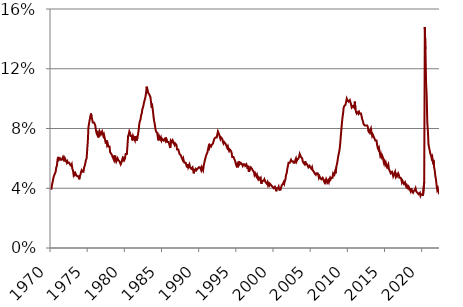
| Category | Series 0 |
|---|---|
| 1970.0 | 3.9 |
| 1970.0 | 4.2 |
| 1970.0 | 4.4 |
| 1970.0 | 4.6 |
| 1970.0 | 4.8 |
| 1970.0 | 4.9 |
| 1970.0 | 5 |
| 1970.0 | 5.1 |
| 1970.0 | 5.4 |
| 1970.0 | 5.5 |
| 1970.0 | 5.9 |
| 1970.0 | 6.1 |
| 1971.0 | 5.9 |
| 1971.0 | 5.9 |
| 1971.0 | 6 |
| 1971.0 | 5.9 |
| 1971.0 | 5.9 |
| 1971.0 | 5.9 |
| 1971.0 | 6 |
| 1971.0 | 6.1 |
| 1971.0 | 6 |
| 1971.0 | 5.8 |
| 1971.0 | 6 |
| 1971.0 | 6 |
| 1972.0 | 5.8 |
| 1972.0 | 5.7 |
| 1972.0 | 5.8 |
| 1972.0 | 5.7 |
| 1972.0 | 5.7 |
| 1972.0 | 5.7 |
| 1972.0 | 5.6 |
| 1972.0 | 5.6 |
| 1972.0 | 5.5 |
| 1972.0 | 5.6 |
| 1972.0 | 5.3 |
| 1972.0 | 5.2 |
| 1973.0 | 4.9 |
| 1973.0 | 5 |
| 1973.0 | 4.9 |
| 1973.0 | 5 |
| 1973.0 | 4.9 |
| 1973.0 | 4.9 |
| 1973.0 | 4.8 |
| 1973.0 | 4.8 |
| 1973.0 | 4.8 |
| 1973.0 | 4.6 |
| 1973.0 | 4.8 |
| 1973.0 | 4.9 |
| 1974.0 | 5.1 |
| 1974.0 | 5.2 |
| 1974.0 | 5.1 |
| 1974.0 | 5.1 |
| 1974.0 | 5.1 |
| 1974.0 | 5.4 |
| 1974.0 | 5.5 |
| 1974.0 | 5.5 |
| 1974.0 | 5.9 |
| 1974.0 | 6 |
| 1974.0 | 6.6 |
| 1974.0 | 7.2 |
| 1975.0 | 8.1 |
| 1975.0 | 8.1 |
| 1975.0 | 8.6 |
| 1975.0 | 8.8 |
| 1975.0 | 9 |
| 1975.0 | 8.8 |
| 1975.0 | 8.6 |
| 1975.0 | 8.4 |
| 1975.0 | 8.4 |
| 1975.0 | 8.4 |
| 1975.0 | 8.3 |
| 1975.0 | 8.2 |
| 1976.0 | 7.9 |
| 1976.0 | 7.7 |
| 1976.0 | 7.6 |
| 1976.0 | 7.7 |
| 1976.0 | 7.4 |
| 1976.0 | 7.6 |
| 1976.0 | 7.8 |
| 1976.0 | 7.8 |
| 1976.0 | 7.6 |
| 1976.0 | 7.7 |
| 1976.0 | 7.8 |
| 1976.0 | 7.8 |
| 1977.0 | 7.5 |
| 1977.0 | 7.6 |
| 1977.0 | 7.4 |
| 1977.0 | 7.2 |
| 1977.0 | 7 |
| 1977.0 | 7.2 |
| 1977.0 | 6.9 |
| 1977.0 | 7 |
| 1977.0 | 6.8 |
| 1977.0 | 6.8 |
| 1977.0 | 6.8 |
| 1977.0 | 6.4 |
| 1978.0 | 6.4 |
| 1978.0 | 6.3 |
| 1978.0 | 6.3 |
| 1978.0 | 6.1 |
| 1978.0 | 6 |
| 1978.0 | 5.9 |
| 1978.0 | 6.2 |
| 1978.0 | 5.9 |
| 1978.0 | 6 |
| 1978.0 | 5.8 |
| 1978.0 | 5.9 |
| 1978.0 | 6 |
| 1979.0 | 5.9 |
| 1979.0 | 5.9 |
| 1979.0 | 5.8 |
| 1979.0 | 5.8 |
| 1979.0 | 5.6 |
| 1979.0 | 5.7 |
| 1979.0 | 5.7 |
| 1979.0 | 6 |
| 1979.0 | 5.9 |
| 1979.0 | 6 |
| 1979.0 | 5.9 |
| 1979.0 | 6 |
| 1980.0 | 6.3 |
| 1980.0 | 6.3 |
| 1980.0 | 6.3 |
| 1980.0 | 6.9 |
| 1980.0 | 7.5 |
| 1980.0 | 7.6 |
| 1980.0 | 7.8 |
| 1980.0 | 7.7 |
| 1980.0 | 7.5 |
| 1980.0 | 7.5 |
| 1980.0 | 7.5 |
| 1980.0 | 7.2 |
| 1981.0 | 7.5 |
| 1981.0 | 7.4 |
| 1981.0 | 7.4 |
| 1981.0 | 7.2 |
| 1981.0 | 7.5 |
| 1981.0 | 7.5 |
| 1981.0 | 7.2 |
| 1981.0 | 7.4 |
| 1981.0 | 7.6 |
| 1981.0 | 7.9 |
| 1981.0 | 8.3 |
| 1981.0 | 8.5 |
| 1982.0 | 8.6 |
| 1982.0 | 8.9 |
| 1982.0 | 9 |
| 1982.0 | 9.3 |
| 1982.0 | 9.4 |
| 1982.0 | 9.6 |
| 1982.0 | 9.8 |
| 1982.0 | 9.8 |
| 1982.0 | 10.1 |
| 1982.0 | 10.4 |
| 1982.0 | 10.8 |
| 1982.0 | 10.8 |
| 1983.0 | 10.4 |
| 1983.0 | 10.4 |
| 1983.0 | 10.3 |
| 1983.0 | 10.2 |
| 1983.0 | 10.1 |
| 1983.0 | 10.1 |
| 1983.0 | 9.4 |
| 1983.0 | 9.5 |
| 1983.0 | 9.2 |
| 1983.0 | 8.8 |
| 1983.0 | 8.5 |
| 1983.0 | 8.3 |
| 1984.0 | 8 |
| 1984.0 | 7.8 |
| 1984.0 | 7.8 |
| 1984.0 | 7.7 |
| 1984.0 | 7.4 |
| 1984.0 | 7.2 |
| 1984.0 | 7.5 |
| 1984.0 | 7.5 |
| 1984.0 | 7.3 |
| 1984.0 | 7.4 |
| 1984.0 | 7.2 |
| 1984.0 | 7.3 |
| 1985.0 | 7.3 |
| 1985.0 | 7.2 |
| 1985.0 | 7.2 |
| 1985.0 | 7.3 |
| 1985.0 | 7.2 |
| 1985.0 | 7.4 |
| 1985.0 | 7.4 |
| 1985.0 | 7.1 |
| 1985.0 | 7.1 |
| 1985.0 | 7.1 |
| 1985.0 | 7 |
| 1985.0 | 7 |
| 1986.0 | 6.7 |
| 1986.0 | 7.2 |
| 1986.0 | 7.2 |
| 1986.0 | 7.1 |
| 1986.0 | 7.2 |
| 1986.0 | 7.2 |
| 1986.0 | 7 |
| 1986.0 | 6.9 |
| 1986.0 | 7 |
| 1986.0 | 7 |
| 1986.0 | 6.9 |
| 1986.0 | 6.6 |
| 1987.0 | 6.6 |
| 1987.0 | 6.6 |
| 1987.0 | 6.6 |
| 1987.0 | 6.3 |
| 1987.0 | 6.3 |
| 1987.0 | 6.2 |
| 1987.0 | 6.1 |
| 1987.0 | 6 |
| 1987.0 | 5.9 |
| 1987.0 | 6 |
| 1987.0 | 5.8 |
| 1987.0 | 5.7 |
| 1988.0 | 5.7 |
| 1988.0 | 5.7 |
| 1988.0 | 5.7 |
| 1988.0 | 5.4 |
| 1988.0 | 5.6 |
| 1988.0 | 5.4 |
| 1988.0 | 5.4 |
| 1988.0 | 5.6 |
| 1988.0 | 5.4 |
| 1988.0 | 5.4 |
| 1988.0 | 5.3 |
| 1988.0 | 5.3 |
| 1989.0 | 5.4 |
| 1989.0 | 5.2 |
| 1989.0 | 5 |
| 1989.0 | 5.2 |
| 1989.0 | 5.2 |
| 1989.0 | 5.3 |
| 1989.0 | 5.2 |
| 1989.0 | 5.2 |
| 1989.0 | 5.3 |
| 1989.0 | 5.3 |
| 1989.0 | 5.4 |
| 1989.0 | 5.4 |
| 1990.0 | 5.4 |
| 1990.0 | 5.3 |
| 1990.0 | 5.2 |
| 1990.0 | 5.4 |
| 1990.0 | 5.4 |
| 1990.0 | 5.2 |
| 1990.0 | 5.5 |
| 1990.0 | 5.7 |
| 1990.0 | 5.9 |
| 1990.0 | 5.9 |
| 1990.0 | 6.2 |
| 1990.0 | 6.3 |
| 1991.0 | 6.4 |
| 1991.0 | 6.6 |
| 1991.0 | 6.8 |
| 1991.0 | 6.7 |
| 1991.0 | 6.9 |
| 1991.0 | 6.9 |
| 1991.0 | 6.8 |
| 1991.0 | 6.9 |
| 1991.0 | 6.9 |
| 1991.0 | 7 |
| 1991.0 | 7 |
| 1991.0 | 7.3 |
| 1992.0 | 7.3 |
| 1992.0 | 7.4 |
| 1992.0 | 7.4 |
| 1992.0 | 7.4 |
| 1992.0 | 7.6 |
| 1992.0 | 7.8 |
| 1992.0 | 7.7 |
| 1992.0 | 7.6 |
| 1992.0 | 7.6 |
| 1992.0 | 7.3 |
| 1992.0 | 7.4 |
| 1992.0 | 7.4 |
| 1993.0 | 7.3 |
| 1993.0 | 7.1 |
| 1993.0 | 7 |
| 1993.0 | 7.1 |
| 1993.0 | 7.1 |
| 1993.0 | 7 |
| 1993.0 | 6.9 |
| 1993.0 | 6.8 |
| 1993.0 | 6.7 |
| 1993.0 | 6.8 |
| 1993.0 | 6.6 |
| 1993.0 | 6.5 |
| 1994.0 | 6.6 |
| 1994.0 | 6.6 |
| 1994.0 | 6.5 |
| 1994.0 | 6.4 |
| 1994.0 | 6.1 |
| 1994.0 | 6.1 |
| 1994.0 | 6.1 |
| 1994.0 | 6 |
| 1994.0 | 5.9 |
| 1994.0 | 5.8 |
| 1994.0 | 5.6 |
| 1994.0 | 5.5 |
| 1995.0 | 5.6 |
| 1995.0 | 5.4 |
| 1995.0 | 5.4 |
| 1995.0 | 5.8 |
| 1995.0 | 5.6 |
| 1995.0 | 5.6 |
| 1995.0 | 5.7 |
| 1995.0 | 5.7 |
| 1995.0 | 5.6 |
| 1995.0 | 5.5 |
| 1995.0 | 5.6 |
| 1995.0 | 5.6 |
| 1996.0 | 5.6 |
| 1996.0 | 5.5 |
| 1996.0 | 5.5 |
| 1996.0 | 5.6 |
| 1996.0 | 5.6 |
| 1996.0 | 5.3 |
| 1996.0 | 5.5 |
| 1996.0 | 5.1 |
| 1996.0 | 5.2 |
| 1996.0 | 5.2 |
| 1996.0 | 5.4 |
| 1996.0 | 5.4 |
| 1997.0 | 5.3 |
| 1997.0 | 5.2 |
| 1997.0 | 5.2 |
| 1997.0 | 5.1 |
| 1997.0 | 4.9 |
| 1997.0 | 5 |
| 1997.0 | 4.9 |
| 1997.0 | 4.8 |
| 1997.0 | 4.9 |
| 1997.0 | 4.7 |
| 1997.0 | 4.6 |
| 1997.0 | 4.7 |
| 1998.0 | 4.6 |
| 1998.0 | 4.6 |
| 1998.0 | 4.7 |
| 1998.0 | 4.3 |
| 1998.0 | 4.4 |
| 1998.0 | 4.5 |
| 1998.0 | 4.5 |
| 1998.0 | 4.5 |
| 1998.0 | 4.6 |
| 1998.0 | 4.5 |
| 1998.0 | 4.4 |
| 1998.0 | 4.4 |
| 1999.0 | 4.3 |
| 1999.0 | 4.4 |
| 1999.0 | 4.2 |
| 1999.0 | 4.3 |
| 1999.0 | 4.2 |
| 1999.0 | 4.3 |
| 1999.0 | 4.3 |
| 1999.0 | 4.2 |
| 1999.0 | 4.2 |
| 1999.0 | 4.1 |
| 1999.0 | 4.1 |
| 1999.0 | 4 |
| 2000.0 | 4 |
| 2000.0 | 4.1 |
| 2000.0 | 4 |
| 2000.0 | 3.8 |
| 2000.0 | 4 |
| 2000.0 | 4 |
| 2000.0 | 4 |
| 2000.0 | 4.1 |
| 2000.0 | 3.9 |
| 2000.0 | 3.9 |
| 2000.0 | 3.9 |
| 2000.0 | 3.9 |
| 2001.0 | 4.2 |
| 2001.0 | 4.2 |
| 2001.0 | 4.3 |
| 2001.0 | 4.4 |
| 2001.0 | 4.3 |
| 2001.0 | 4.5 |
| 2001.0 | 4.6 |
| 2001.0 | 4.9 |
| 2001.0 | 5 |
| 2001.0 | 5.3 |
| 2001.0 | 5.5 |
| 2001.0 | 5.7 |
| 2002.0 | 5.7 |
| 2002.0 | 5.7 |
| 2002.0 | 5.7 |
| 2002.0 | 5.9 |
| 2002.0 | 5.8 |
| 2002.0 | 5.8 |
| 2002.0 | 5.8 |
| 2002.0 | 5.7 |
| 2002.0 | 5.7 |
| 2002.0 | 5.7 |
| 2002.0 | 5.9 |
| 2002.0 | 6 |
| 2003.0 | 5.8 |
| 2003.0 | 5.9 |
| 2003.0 | 5.9 |
| 2003.0 | 6 |
| 2003.0 | 6.1 |
| 2003.0 | 6.3 |
| 2003.0 | 6.2 |
| 2003.0 | 6.1 |
| 2003.0 | 6.1 |
| 2003.0 | 6 |
| 2003.0 | 5.8 |
| 2003.0 | 5.7 |
| 2004.0 | 5.7 |
| 2004.0 | 5.6 |
| 2004.0 | 5.8 |
| 2004.0 | 5.6 |
| 2004.0 | 5.6 |
| 2004.0 | 5.6 |
| 2004.0 | 5.5 |
| 2004.0 | 5.4 |
| 2004.0 | 5.4 |
| 2004.0 | 5.5 |
| 2004.0 | 5.4 |
| 2004.0 | 5.4 |
| 2005.0 | 5.3 |
| 2005.0 | 5.4 |
| 2005.0 | 5.2 |
| 2005.0 | 5.2 |
| 2005.0 | 5.1 |
| 2005.0 | 5 |
| 2005.0 | 5 |
| 2005.0 | 4.9 |
| 2005.0 | 5 |
| 2005.0 | 5 |
| 2005.0 | 5 |
| 2005.0 | 4.9 |
| 2006.0 | 4.7 |
| 2006.0 | 4.8 |
| 2006.0 | 4.7 |
| 2006.0 | 4.7 |
| 2006.0 | 4.6 |
| 2006.0 | 4.6 |
| 2006.0 | 4.7 |
| 2006.0 | 4.7 |
| 2006.0 | 4.5 |
| 2006.0 | 4.4 |
| 2006.0 | 4.5 |
| 2006.0 | 4.4 |
| 2007.0 | 4.6 |
| 2007.0 | 4.5 |
| 2007.0 | 4.4 |
| 2007.0 | 4.5 |
| 2007.0 | 4.4 |
| 2007.0 | 4.6 |
| 2007.0 | 4.7 |
| 2007.0 | 4.6 |
| 2007.0 | 4.7 |
| 2007.0 | 4.7 |
| 2007.0 | 4.7 |
| 2007.0 | 5 |
| 2008.0 | 5 |
| 2008.0 | 4.9 |
| 2008.0 | 5.1 |
| 2008.0 | 5 |
| 2008.0 | 5.4 |
| 2008.0 | 5.6 |
| 2008.0 | 5.8 |
| 2008.0 | 6.1 |
| 2008.0 | 6.1 |
| 2008.0 | 6.5 |
| 2008.0 | 6.8 |
| 2008.0 | 7.3 |
| 2009.0 | 7.8 |
| 2009.0 | 8.3 |
| 2009.0 | 8.7 |
| 2009.0 | 9 |
| 2009.0 | 9.4 |
| 2009.0 | 9.5 |
| 2009.0 | 9.5 |
| 2009.0 | 9.6 |
| 2009.0 | 9.8 |
| 2009.0 | 10 |
| 2009.0 | 9.9 |
| 2009.0 | 9.9 |
| 2010.0 | 9.8 |
| 2010.0 | 9.8 |
| 2010.0 | 9.9 |
| 2010.0 | 9.9 |
| 2010.0 | 9.6 |
| 2010.0 | 9.4 |
| 2010.0 | 9.4 |
| 2010.0 | 9.5 |
| 2010.0 | 9.5 |
| 2010.0 | 9.4 |
| 2010.0 | 9.8 |
| 2010.0 | 9.3 |
| 2011.0 | 9.1 |
| 2011.0 | 9 |
| 2011.0 | 9 |
| 2011.0 | 9.1 |
| 2011.0 | 9 |
| 2011.0 | 9.1 |
| 2011.0 | 9 |
| 2011.0 | 9 |
| 2011.0 | 9 |
| 2011.0 | 8.8 |
| 2011.0 | 8.6 |
| 2011.0 | 8.5 |
| 2012.0 | 8.3 |
| 2012.0 | 8.3 |
| 2012.0 | 8.2 |
| 2012.0 | 8.2 |
| 2012.0 | 8.2 |
| 2012.0 | 8.2 |
| 2012.0 | 8.2 |
| 2012.0 | 8.1 |
| 2012.0 | 7.8 |
| 2012.0 | 7.8 |
| 2012.0 | 7.7 |
| 2012.0 | 7.9 |
| 2013.0 | 8 |
| 2013.0 | 7.7 |
| 2013.0 | 7.5 |
| 2013.0 | 7.6 |
| 2013.0 | 7.5 |
| 2013.0 | 7.5 |
| 2013.0 | 7.3 |
| 2013.0 | 7.2 |
| 2013.0 | 7.2 |
| 2013.0 | 7.2 |
| 2013.0 | 6.9 |
| 2013.0 | 6.7 |
| 2014.0 | 6.6 |
| 2014.0 | 6.7 |
| 2014.0 | 6.7 |
| 2014.0 | 6.2 |
| 2014.0 | 6.3 |
| 2014.0 | 6.1 |
| 2014.0 | 6.2 |
| 2014.0 | 6.1 |
| 2014.0 | 5.9 |
| 2014.0 | 5.7 |
| 2014.0 | 5.8 |
| 2014.0 | 5.6 |
| 2015.0 | 5.7 |
| 2015.0 | 5.5 |
| 2015.0 | 5.4 |
| 2015.0 | 5.4 |
| 2015.0 | 5.6 |
| 2015.0 | 5.3 |
| 2015.0 | 5.2 |
| 2015.0 | 5.1 |
| 2015.0 | 5 |
| 2015.0 | 5 |
| 2015.0 | 5.1 |
| 2015.0 | 5 |
| 2016.0 | 4.8 |
| 2016.0 | 4.9 |
| 2016.0 | 5 |
| 2016.0 | 5.1 |
| 2016.0 | 4.8 |
| 2016.0 | 4.9 |
| 2016.0 | 4.8 |
| 2016.0 | 4.9 |
| 2016.0 | 5 |
| 2016.0 | 4.9 |
| 2016.0 | 4.7 |
| 2016.0 | 4.7 |
| 2017.0 | 4.7 |
| 2017.0 | 4.6 |
| 2017.0 | 4.4 |
| 2017.0 | 4.5 |
| 2017.0 | 4.4 |
| 2017.0 | 4.3 |
| 2017.0 | 4.3 |
| 2017.0 | 4.4 |
| 2017.0 | 4.2 |
| 2017.0 | 4.1 |
| 2017.0 | 4.2 |
| 2017.0 | 4.1 |
| 2018.0 | 4 |
| 2018.0 | 4.1 |
| 2018.0 | 4 |
| 2018.0 | 4 |
| 2018.0 | 3.8 |
| 2018.0 | 4 |
| 2018.0 | 3.8 |
| 2018.0 | 3.8 |
| 2018.0 | 3.7 |
| 2018.0 | 3.8 |
| 2018.0 | 3.8 |
| 2018.0 | 3.9 |
| 2019.0 | 4 |
| 2019.0 | 3.8 |
| 2019.0 | 3.8 |
| 2019.0 | 3.7 |
| 2019.0 | 3.7 |
| 2019.0 | 3.6 |
| 2019.0 | 3.6 |
| 2019.0 | 3.7 |
| 2019.0 | 3.5 |
| 2019.0 | 3.6 |
| 2019.0 | 3.6 |
| 2019.0 | 3.6 |
| 2020.0 | 3.5 |
| 2020.0 | 3.5 |
| 2020.0 | 4.4 |
| 2020.0 | 14.8 |
| 2020.0 | 13.3 |
| 2020.0 | 11.1 |
| 2020.0 | 10.2 |
| 2020.0 | 8.4 |
| 2020.0 | 7.8 |
| 2020.0 | 6.9 |
| 2020.0 | 6.7 |
| 2020.0 | 6.7 |
| 2021.0 | 6.3 |
| 2021.0 | 6.2 |
| 2021.0 | 6 |
| 2021.0 | 6.1 |
| 2021.0 | 5.8 |
| 2021.0 | 5.9 |
| 2021.0 | 5.4 |
| 2021.0 | 5.2 |
| 2021.0 | 4.8 |
| 2021.0 | 4.6 |
| 2021.0 | 4.2 |
| 2021.0 | 3.9 |
| 2022.0 | 4 |
| 2022.0 | 3.8 |
| 2022.0 | 3.6 |
| 2022.0 | 3.6 |